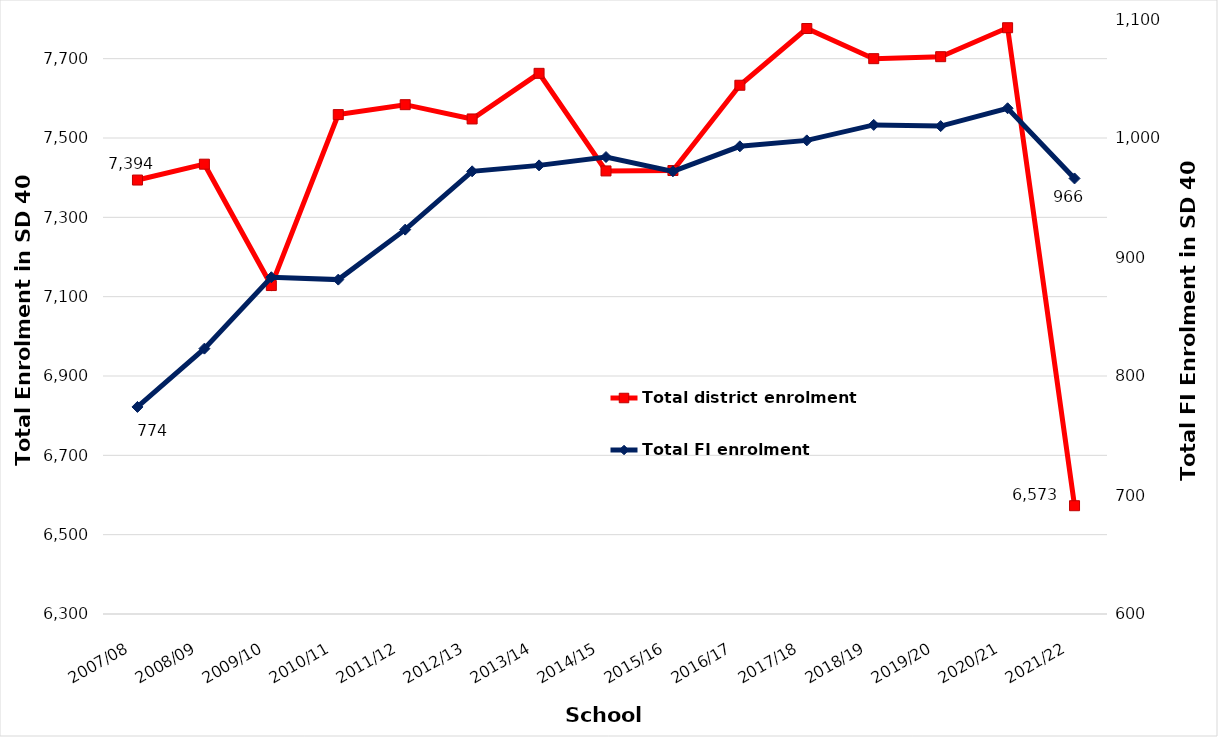
| Category | Total district enrolment  |
|---|---|
| 2007/08 | 7394 |
| 2008/09 | 7434 |
| 2009/10 | 7128 |
| 2010/11 | 7559 |
| 2011/12 | 7584 |
| 2012/13 | 7548 |
| 2013/14 | 7663 |
| 2014/15 | 7417 |
| 2015/16 | 7418 |
| 2016/17 | 7633 |
| 2017/18 | 7776 |
| 2018/19 | 7700 |
| 2019/20 | 7705 |
| 2020/21 | 7778 |
| 2021/22 | 6573 |